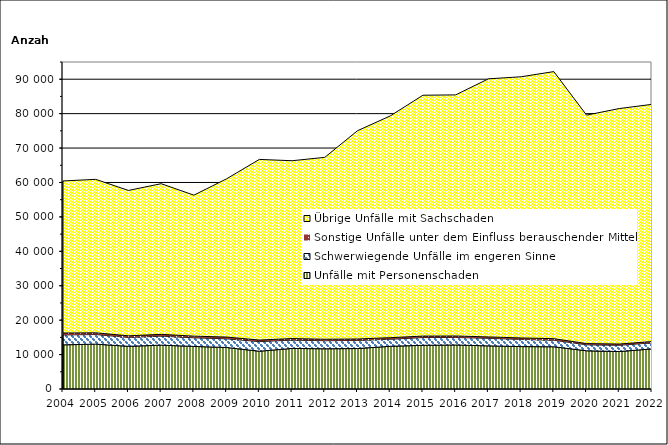
| Category | Unfälle mit Personenschaden | Schwerwiegende Unfälle im engeren Sinne | Sonstige Unfälle unter dem Einfluss berauschender Mittel 1) | Übrige Unfälle mit Sachschaden |
|---|---|---|---|---|
| 2004.0 | 12827 | 2877 | 564 | 44173 |
| 2005.0 | 13033 | 2795 | 499 | 44581 |
| 2006.0 | 12400 | 2588 | 466 | 42228 |
| 2007.0 | 12740 | 2628 | 507 | 43770 |
| 2008.0 | 12369 | 2510 | 481 | 40954 |
| 2009.0 | 12061 | 2528 | 502 | 45976 |
| 2010.0 | 10974 | 2803 | 441 | 52481 |
| 2011.0 | 11793 | 2419 | 443 | 51662 |
| 2012.0 | 11682 | 2353 | 422 | 52839 |
| 2013.0 | 11757 | 2357 | 414 | 60506 |
| 2014.0 | 12404 | 2056 | 448 | 64425 |
| 2015.0 | 12695 | 2249 | 427 | 69975 |
| 2016.0 | 12783 | 2187 | 433 | 70040 |
| 2017.0 | 12528 | 2214 | 385 | 74978 |
| 2018.0 | 12324 | 2084 | 421 | 75878 |
| 2019.0 | 12271 | 1914 | 438 | 77586 |
| 2020.0 | 11099 | 1748 | 347 | 66372 |
| 2021.0 | 10882 | 1827 | 359 | 68407 |
| 2022.0 | 11651 | 1753 | 382 | 68911 |